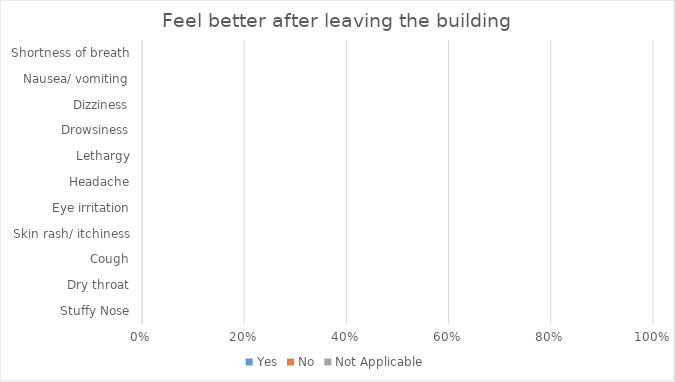
| Category | Yes | No | Not Applicable |
|---|---|---|---|
| Stuffy Nose | 0 | 0 | 0 |
| Dry throat | 0 | 0 | 0 |
| Cough | 0 | 0 | 0 |
| Skin rash/ itchiness | 0 | 0 | 0 |
| Eye irritation | 0 | 0 | 0 |
| Headache | 0 | 0 | 0 |
| Lethargy | 0 | 0 | 0 |
| Drowsiness | 0 | 0 | 0 |
| Dizziness | 0 | 0 | 0 |
| Nausea/ vomiting | 0 | 0 | 0 |
| Shortness of breath | 0 | 0 | 0 |